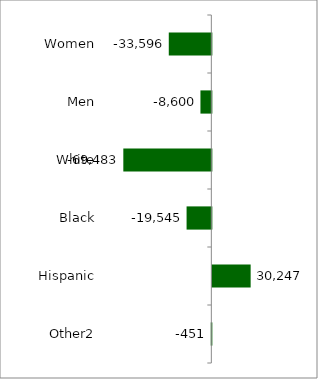
| Category | 50 states and D.C. |
|---|---|
| Women | -33596 |
| Men | -8600 |
| White | -69483 |
| Black | -19545 |
| Hispanic | 30247 |
| Other2 | -451 |